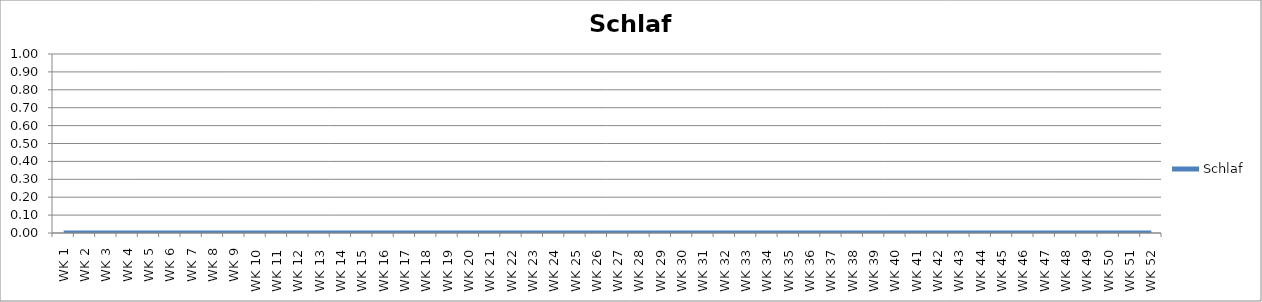
| Category | Schlaf |
|---|---|
| WK 1 | 0 |
| WK 2 | 0 |
| WK 3 | 0 |
| WK 4 | 0 |
| WK 5 | 0 |
| WK 6 | 0 |
| WK 7 | 0 |
| WK 8 | 0 |
| WK 9 | 0 |
| WK 10 | 0 |
| WK 11 | 0 |
| WK 12 | 0 |
| WK 13 | 0 |
| WK 14 | 0 |
| WK 15 | 0 |
| WK 16 | 0 |
| WK 17 | 0 |
| WK 18 | 0 |
| WK 19 | 0 |
| WK 20 | 0 |
| WK 21 | 0 |
| WK 22 | 0 |
| WK 23 | 0 |
| WK 24 | 0 |
| WK 25 | 0 |
| WK 26 | 0 |
| WK 27 | 0 |
| WK 28 | 0 |
| WK 29 | 0 |
| WK 30 | 0 |
| WK 31 | 0 |
| WK 32 | 0 |
| WK 33 | 0 |
| WK 34 | 0 |
| WK 35 | 0 |
| WK 36 | 0 |
| WK 37 | 0 |
| WK 38 | 0 |
| WK 39 | 0 |
| WK 40 | 0 |
| WK 41 | 0 |
| WK 42 | 0 |
| WK 43 | 0 |
| WK 44 | 0 |
| WK 45 | 0 |
| WK 46 | 0 |
| WK 47 | 0 |
| WK 48 | 0 |
| WK 49 | 0 |
| WK 50 | 0 |
| WK 51 | 0 |
| WK 52 | 0 |